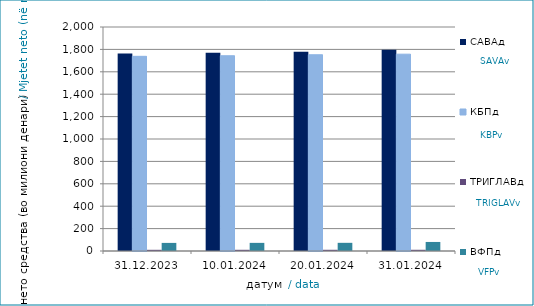
| Category | САВАд | КБПд | ТРИГЛАВд | ВФПд |
|---|---|---|---|---|
| 2023-12-31 | 1763.844 | 1738.268 | 10.65 | 72.303 |
| 2024-01-10 | 1769.518 | 1743.429 | 10.76 | 72.585 |
| 2024-01-20 | 1779.752 | 1752.163 | 10.854 | 73.004 |
| 2024-01-31 | 1796.847 | 1757.28 | 10.864 | 80.731 |